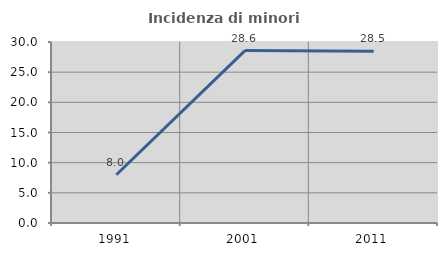
| Category | Incidenza di minori stranieri |
|---|---|
| 1991.0 | 8 |
| 2001.0 | 28.571 |
| 2011.0 | 28.487 |